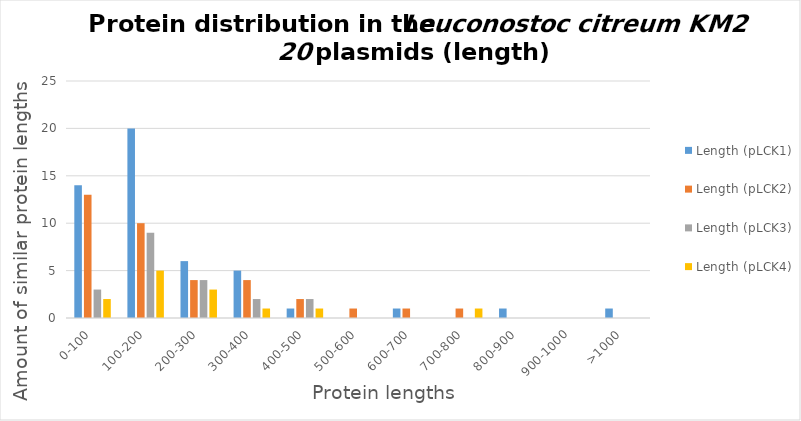
| Category | Length (pLCK1) | Length (pLCK2) | Length (pLCK3) | Length (pLCK4) |
|---|---|---|---|---|
| 0-100 | 14 | 13 | 3 | 2 |
| 100-200 | 20 | 10 | 9 | 5 |
| 200-300 | 6 | 4 | 4 | 3 |
| 300-400 | 5 | 4 | 2 | 1 |
| 400-500 | 1 | 2 | 2 | 1 |
| 500-600 | 0 | 1 | 0 | 0 |
| 600-700 | 1 | 1 | 0 | 0 |
| 700-800 | 0 | 1 | 0 | 1 |
| 800-900 | 1 | 0 | 0 | 0 |
| 900-1000 | 0 | 0 | 0 | 0 |
| >1000 | 1 | 0 | 0 | 0 |